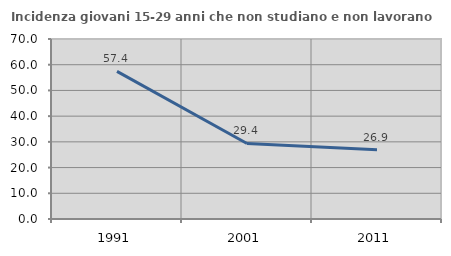
| Category | Incidenza giovani 15-29 anni che non studiano e non lavorano  |
|---|---|
| 1991.0 | 57.429 |
| 2001.0 | 29.376 |
| 2011.0 | 26.907 |